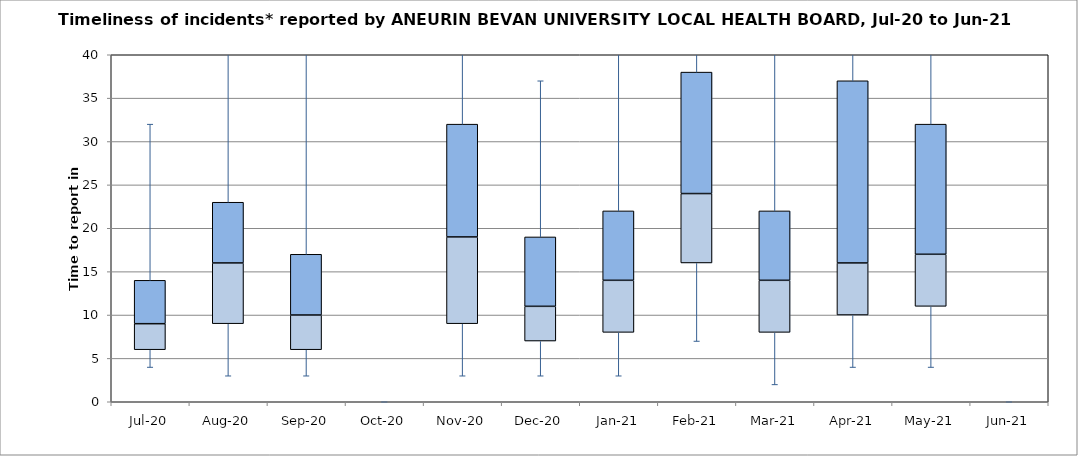
| Category | Series 0 | Series 1 | Series 2 |
|---|---|---|---|
| Jul-20 | 6 | 3 | 5 |
| Aug-20 | 9 | 7 | 7 |
| Sep-20 | 6 | 4 | 7 |
| Oct-20 | 0 | 0 | 0 |
| Nov-20 | 9 | 10 | 13 |
| Dec-20 | 7 | 4 | 8 |
| Jan-21 | 8 | 6 | 8 |
| Feb-21 | 16 | 8 | 14 |
| Mar-21 | 8 | 6 | 8 |
| Apr-21 | 10 | 6 | 21 |
| May-21 | 11 | 6 | 15 |
| Jun-21 | 0 | 0 | 0 |